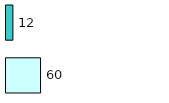
| Category | Series 0 | Series 1 |
|---|---|---|
| 0 | 60 | 12 |